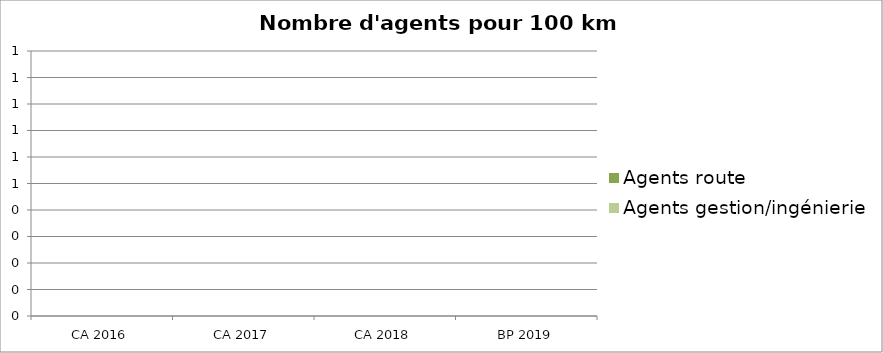
| Category | Agents route | Agents gestion/ingénierie |
|---|---|---|
| CA 2016 | 0 | 0 |
| CA 2017 | 0 | 0 |
| CA 2018 | 0 | 0 |
| BP 2019 | 0 | 0 |